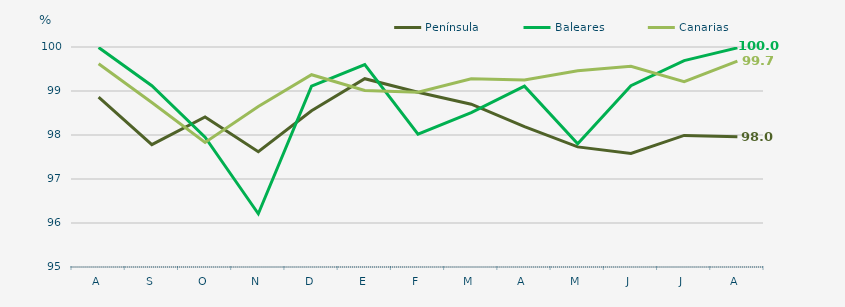
| Category | Península | Baleares | Canarias |
|---|---|---|---|
| A | 98.86 | 99.99 | 99.62 |
| S | 97.78 | 99.12 | 98.74 |
| O | 98.41 | 97.95 | 97.83 |
| N | 97.62 | 96.21 | 98.65 |
| D | 98.55 | 99.11 | 99.37 |
| E | 99.28 | 99.6 | 99.01 |
| F | 98.97 | 98.02 | 98.97 |
| M | 98.7 | 98.51 | 99.28 |
| A | 98.19 | 99.11 | 99.25 |
| M | 97.73 | 97.8 | 99.46 |
| J | 97.58 | 99.12 | 99.56 |
| J | 97.99 | 99.69 | 99.21 |
| A | 97.96 | 99.98 | 99.68 |